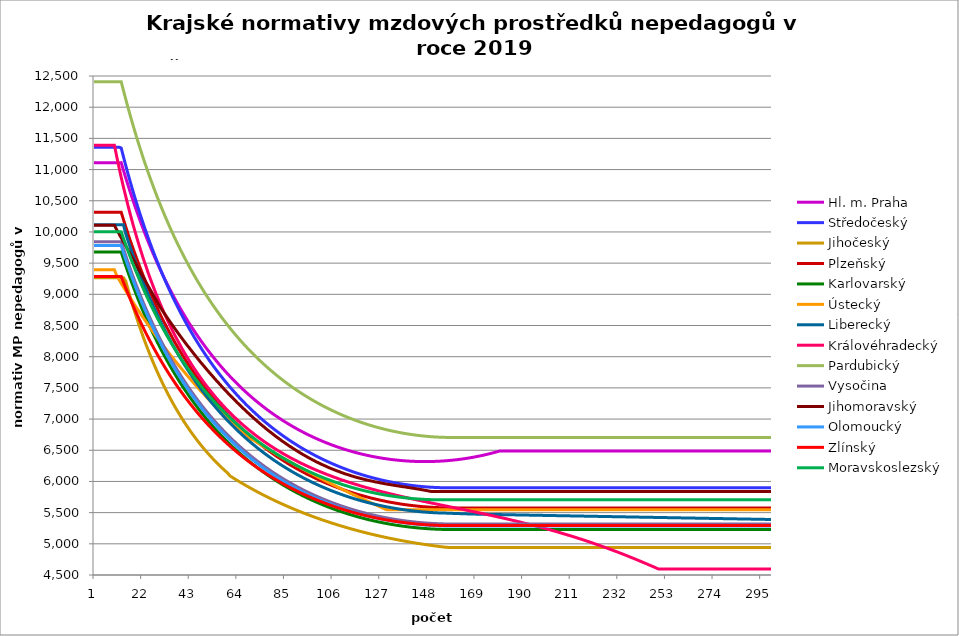
| Category | Hl. m. Praha | Středočeský | Jihočeský | Plzeňský | Karlovarský  | Ústecký   | Liberecký | Královéhradecký | Pardubický | Vysočina | Jihomoravský | Olomoucký | Zlínský | Moravskoslezský |
|---|---|---|---|---|---|---|---|---|---|---|---|---|---|---|
| 0 | 11109.441 | 11358.889 | 9267.509 | 10314.577 | 9676.562 | 9393.486 | 10113.352 | 11389.037 | 12408.336 | 9841.382 | 10108.319 | 9781.481 | 9286.742 | 10002.601 |
| 1 | 11109.441 | 11358.889 | 9267.509 | 10314.577 | 9676.562 | 9393.486 | 10113.352 | 11389.037 | 12408.336 | 9841.382 | 10108.319 | 9781.481 | 9286.742 | 10002.601 |
| 2 | 11109.441 | 11358.889 | 9267.509 | 10314.577 | 9676.562 | 9393.486 | 10113.352 | 11389.037 | 12408.336 | 9841.382 | 10108.319 | 9781.481 | 9286.742 | 10002.601 |
| 3 | 11109.441 | 11358.889 | 9267.509 | 10314.577 | 9676.562 | 9393.486 | 10113.352 | 11389.037 | 12408.336 | 9841.382 | 10108.319 | 9781.481 | 9286.742 | 10002.601 |
| 4 | 11109.441 | 11358.889 | 9267.509 | 10314.577 | 9676.562 | 9393.486 | 10113.352 | 11389.037 | 12408.336 | 9841.382 | 10108.319 | 9781.481 | 9286.742 | 10002.601 |
| 5 | 11109.441 | 11358.889 | 9267.509 | 10314.577 | 9676.562 | 9393.486 | 10113.352 | 11389.037 | 12408.336 | 9841.382 | 10108.319 | 9781.481 | 9286.742 | 10002.601 |
| 6 | 11109.441 | 11358.889 | 9267.509 | 10314.577 | 9676.562 | 9393.486 | 10113.352 | 11389.037 | 12408.336 | 9841.382 | 10108.319 | 9781.481 | 9286.742 | 10002.601 |
| 7 | 11109.441 | 11358.889 | 9267.509 | 10314.577 | 9676.562 | 9393.486 | 10113.352 | 11389.037 | 12408.336 | 9841.382 | 10108.319 | 9781.481 | 9286.742 | 10002.601 |
| 8 | 11109.441 | 11358.889 | 9267.509 | 10314.577 | 9676.562 | 9393.486 | 10113.352 | 11389.037 | 12408.336 | 9841.382 | 10108.319 | 9781.481 | 9286.742 | 10002.601 |
| 9 | 11109.441 | 11358.889 | 9267.509 | 10314.577 | 9676.562 | 9393.486 | 10113.352 | 11389.037 | 12408.336 | 9841.382 | 10108.319 | 9781.481 | 9286.742 | 10002.601 |
| 10 | 11109.441 | 11358.889 | 9267.509 | 10314.577 | 9676.562 | 9299.346 | 10113.352 | 11211.862 | 12408.336 | 9841.382 | 10035.904 | 9781.481 | 9286.742 | 10002.601 |
| 11 | 11109.441 | 11358.889 | 9267.509 | 10314.577 | 9676.562 | 9238.961 | 10113.352 | 11040.115 | 12408.336 | 9841.382 | 9972.864 | 9781.481 | 9286.742 | 10002.601 |
| 12 | 11111.32 | 11345.101 | 9267.509 | 10314.577 | 9676.648 | 9175.408 | 10113.442 | 10873.55 | 12408.446 | 9841.382 | 9906.489 | 9781.481 | 9286.742 | 10001.096 |
| 13 | 10987.337 | 11202.878 | 9267.509 | 10197.109 | 9565.606 | 9116.617 | 10113.557 | 10716.914 | 12266.056 | 9728.451 | 9840.992 | 9666.405 | 9192.038 | 9896.014 |
| 14 | 10866.988 | 11065.125 | 9210.044 | 10082.287 | 9457.821 | 9058.574 | 9971.097 | 10569.569 | 12127.843 | 9618.916 | 9776.355 | 9558.121 | 9099.877 | 9793.84 |
| 15 | 10750.127 | 10931.644 | 9078.972 | 9970.021 | 9353.159 | 8997.47 | 9859.802 | 10421.509 | 11993.634 | 9512.634 | 9708.602 | 9452.237 | 9010.164 | 9694.462 |
| 16 | 10636.614 | 10802.248 | 8952.877 | 9860.229 | 9251.493 | 8940.93 | 9751.714 | 10282.122 | 11863.267 | 9409.074 | 9645.687 | 9348.673 | 8922.81 | 9597.776 |
| 17 | 10526.316 | 10676.762 | 8831.502 | 9756.915 | 9152.704 | 8885.096 | 9646.703 | 10146.414 | 11736.589 | 9308.524 | 9579.726 | 9251.209 | 8837.728 | 9503.68 |
| 18 | 10419.108 | 10555.021 | 8714.604 | 9655.745 | 9056.679 | 8826.303 | 9544.649 | 10018.593 | 11613.455 | 9210.865 | 9514.662 | 9151.98 | 8754.838 | 9412.079 |
| 19 | 10314.871 | 10436.869 | 8601.96 | 9556.65 | 8963.31 | 8771.887 | 9445.434 | 9893.951 | 11493.727 | 9115.981 | 9446.727 | 9058.555 | 8674.062 | 9322.883 |
| 20 | 10213.494 | 10322.157 | 8493.359 | 9459.569 | 8872.494 | 8718.137 | 9348.95 | 9772.373 | 11377.274 | 9023.766 | 9383.452 | 8967.017 | 8595.325 | 9236.004 |
| 21 | 10114.868 | 10210.747 | 8388.608 | 9364.441 | 8784.137 | 8661.526 | 9255.093 | 9657.789 | 11263.972 | 8933.757 | 9317.371 | 8877.311 | 8518.559 | 9151.362 |
| 22 | 10018.892 | 10102.507 | 8287.522 | 9271.207 | 8698.146 | 8609.117 | 9163.764 | 9545.861 | 11153.705 | 8846.23 | 9252.214 | 8792.866 | 8443.694 | 9068.876 |
| 23 | 9925.471 | 9997.311 | 8189.931 | 9183.432 | 8614.433 | 8557.338 | 9074.869 | 9440.36 | 11046.359 | 8761.093 | 9187.963 | 8706.593 | 8370.669 | 8988.473 |
| 24 | 9834.511 | 9895.041 | 8095.673 | 9097.304 | 8532.917 | 8502.789 | 8988.319 | 9333.387 | 10941.83 | 8678.257 | 9124.598 | 8625.35 | 8299.42 | 8910.083 |
| 25 | 9745.927 | 9795.586 | 8004.599 | 9012.776 | 8453.517 | 8452.277 | 8904.03 | 9232.506 | 10840.016 | 8597.639 | 9062.1 | 8545.609 | 8229.891 | 8833.635 |
| 26 | 9659.634 | 9698.838 | 7916.567 | 8929.804 | 8376.16 | 8402.362 | 8821.92 | 9137.401 | 10740.82 | 8518.831 | 8997.053 | 8467.328 | 8162.024 | 8759.068 |
| 27 | 9575.553 | 9604.698 | 7831.445 | 8848.347 | 8300.774 | 8349.765 | 8741.914 | 9040.69 | 10644.151 | 8442.096 | 8932.933 | 8390.469 | 8095.767 | 8686.317 |
| 28 | 9493.61 | 9513.068 | 7749.107 | 8771.665 | 8227.29 | 8301.05 | 8663.937 | 8952.95 | 10549.923 | 8367.362 | 8869.721 | 8314.993 | 8031.069 | 8615.324 |
| 29 | 9413.731 | 9423.857 | 7669.435 | 8693.055 | 8155.644 | 8252.9 | 8587.921 | 8863.49 | 10458.051 | 8294.559 | 8804.14 | 8243.924 | 7967.88 | 8546.034 |
| 30 | 9335.849 | 9336.979 | 7592.32 | 8619.03 | 8085.774 | 8202.152 | 8513.799 | 8779.14 | 10368.456 | 8223.621 | 8749.155 | 8171.05 | 7906.155 | 8478.391 |
| 31 | 9259.897 | 9252.351 | 7517.656 | 8546.256 | 8017.621 | 8155.139 | 8441.507 | 8696.38 | 10281.062 | 8154.185 | 8694.852 | 8102.411 | 7845.847 | 8412.343 |
| 32 | 9185.813 | 9169.895 | 7445.345 | 8477.786 | 7951.128 | 8108.663 | 8370.986 | 8615.166 | 10195.798 | 8086.501 | 8641.219 | 8034.915 | 7786.915 | 8347.843 |
| 33 | 9113.538 | 9089.535 | 7375.293 | 8407.367 | 7886.242 | 8059.668 | 8302.176 | 8538.615 | 10112.593 | 8020.51 | 8588.244 | 7971.398 | 7729.317 | 8284.841 |
| 34 | 9043.013 | 9011.2 | 7307.413 | 8341.096 | 7822.91 | 8014.27 | 8235.023 | 8463.413 | 10031.383 | 7956.157 | 8535.914 | 7906.058 | 7673.013 | 8223.293 |
| 35 | 8974.184 | 8934.822 | 7241.62 | 8272.921 | 7761.084 | 7969.38 | 8169.474 | 8389.523 | 9952.102 | 7893.39 | 8484.218 | 7844.554 | 7617.966 | 8163.156 |
| 36 | 8906.998 | 8860.336 | 7177.838 | 8208.745 | 7700.716 | 7922.049 | 8105.478 | 8319.913 | 9874.692 | 7831.882 | 8433.144 | 7784 | 7564.14 | 8104.386 |
| 37 | 8841.406 | 8787.679 | 7115.989 | 8145.556 | 7641.761 | 7878.184 | 8042.987 | 8251.449 | 9799.094 | 7771.868 | 8382.682 | 7724.373 | 7511.498 | 8046.945 |
| 38 | 8777.36 | 8716.793 | 7056.005 | 8086.141 | 7584.176 | 7834.802 | 7981.955 | 8184.102 | 9725.252 | 7713.303 | 8332.82 | 7665.653 | 7460.009 | 7990.794 |
| 39 | 8714.812 | 8647.62 | 6997.817 | 8024.819 | 7527.919 | 7789.051 | 7922.337 | 8117.846 | 9653.114 | 7656.142 | 8283.548 | 7607.819 | 7409.639 | 7935.897 |
| 40 | 8653.72 | 8580.106 | 6941.361 | 7967.146 | 7472.952 | 7746.642 | 7864.09 | 8055.466 | 9582.628 | 7600.342 | 8234.855 | 7553.422 | 7360.357 | 7882.216 |
| 41 | 8594.04 | 8514.2 | 6886.578 | 7910.296 | 7419.234 | 7701.913 | 7807.175 | 7994.038 | 9513.746 | 7545.606 | 8186.731 | 7499.797 | 7312.134 | 7829.72 |
| 42 | 8535.732 | 8449.851 | 6833.41 | 7854.251 | 7366.731 | 7660.445 | 7751.551 | 7936.27 | 9446.421 | 7492.158 | 8141.949 | 7444.43 | 7264.941 | 7778.374 |
| 43 | 8478.757 | 8387.013 | 6781.803 | 7798.995 | 7315.407 | 7619.422 | 7697.181 | 7876.639 | 9380.607 | 7439.96 | 8094.901 | 7394.8 | 7218.751 | 7728.147 |
| 44 | 8423.077 | 8325.639 | 6731.703 | 7744.511 | 7265.227 | 7576.145 | 7644.029 | 7820.549 | 9316.262 | 7388.976 | 8048.395 | 7343.396 | 7173.537 | 7679.01 |
| 45 | 8368.657 | 8265.686 | 6683.062 | 7693.325 | 7216.161 | 7536.017 | 7592.061 | 7765.253 | 9253.343 | 7339.171 | 8002.419 | 7292.702 | 7129.272 | 7630.932 |
| 46 | 8315.462 | 8207.111 | 6635.833 | 7642.81 | 7168.176 | 7496.312 | 7541.244 | 7713.311 | 9191.812 | 7290.272 | 7956.966 | 7245.069 | 7085.934 | 7583.887 |
| 47 | 8263.458 | 8149.875 | 6589.97 | 7592.955 | 7121.244 | 7454.418 | 7491.544 | 7662.06 | 9131.63 | 7242.492 | 7912.027 | 7198.053 | 7043.497 | 7537.846 |
| 48 | 8212.614 | 8093.94 | 6545.432 | 7543.746 | 7075.334 | 7415.566 | 7442.932 | 7611.485 | 9072.76 | 7195.801 | 7870.192 | 7151.644 | 7001.939 | 7492.784 |
| 49 | 8162.899 | 8039.267 | 6502.177 | 7495.171 | 7030.42 | 7377.117 | 7395.379 | 7561.574 | 9015.166 | 7150.169 | 7826.224 | 7105.83 | 6961.238 | 7448.677 |
| 50 | 8114.283 | 7985.822 | 6460.166 | 7447.217 | 6986.475 | 7336.542 | 7348.855 | 7514.761 | 8958.815 | 7105.566 | 7782.745 | 7060.598 | 6921.373 | 7405.499 |
| 51 | 8066.739 | 7933.57 | 6419.363 | 7402.226 | 6943.473 | 7298.906 | 7303.333 | 7468.523 | 8903.673 | 7061.741 | 7739.747 | 7018.159 | 6882.322 | 7363.227 |
| 52 | 8020.237 | 7882.479 | 6379.731 | 7357.775 | 6901.39 | 7261.654 | 7258.787 | 7422.852 | 8849.71 | 7018.897 | 7699.709 | 6976.226 | 6844.067 | 7321.84 |
| 53 | 7974.753 | 7832.516 | 6341.238 | 7313.855 | 6860.201 | 7222.335 | 7215.192 | 7377.735 | 8796.893 | 6977.007 | 7657.621 | 6934.792 | 6806.588 | 7281.314 |
| 54 | 7930.26 | 7783.652 | 6303.85 | 7270.456 | 6819.885 | 7185.859 | 7172.523 | 7335.496 | 8745.195 | 6936.048 | 7615.99 | 6893.847 | 6769.866 | 7241.631 |
| 55 | 7886.734 | 7735.857 | 6267.538 | 7229.814 | 6780.419 | 7149.749 | 7130.756 | 7293.738 | 8694.587 | 6895.995 | 7577.219 | 6853.383 | 6733.884 | 7202.769 |
| 56 | 7844.152 | 7689.104 | 6232.271 | 7187.404 | 6741.781 | 7111.629 | 7089.87 | 7252.453 | 8645.042 | 6856.614 | 7536.456 | 6813.391 | 6698.624 | 7164.709 |
| 57 | 7802.49 | 7643.364 | 6198.021 | 7147.682 | 6703.952 | 7076.26 | 7049.842 | 7213.888 | 8596.533 | 6818.098 | 7496.128 | 6775.932 | 6664.071 | 7127.431 |
| 58 | 7761.727 | 7598.613 | 6164.762 | 7108.397 | 6666.911 | 7041.241 | 7010.65 | 7173.499 | 8549.035 | 6780.427 | 7458.566 | 6738.882 | 6630.207 | 7090.919 |
| 59 | 7721.841 | 7554.825 | 6132.468 | 7069.541 | 6630.639 | 7004.266 | 6972.276 | 7135.767 | 8502.524 | 6743.579 | 7419.065 | 6702.236 | 6597.017 | 7055.155 |
| 60 | 7682.813 | 7511.975 | 6088.277 | 7031.108 | 6595.119 | 6969.954 | 6934.698 | 7100.616 | 8456.976 | 6707.534 | 7382.269 | 6665.986 | 6564.486 | 7020.121 |
| 61 | 7644.621 | 7470.041 | 6065.288 | 6995.192 | 6560.332 | 6935.977 | 6897.899 | 7063.645 | 8412.368 | 6672.074 | 7343.571 | 6630.126 | 6532.599 | 6985.801 |
| 62 | 7607.248 | 7429 | 6042.645 | 6957.561 | 6526.26 | 6900.097 | 6861.859 | 7029.198 | 8368.678 | 6637.382 | 7307.518 | 6596.61 | 6501.343 | 6952.179 |
| 63 | 7570.675 | 7388.83 | 6020.342 | 6922.391 | 6492.889 | 6866.795 | 6826.561 | 6995.086 | 8325.885 | 6603.443 | 7269.597 | 6563.432 | 6470.704 | 6919.241 |
| 64 | 7534.884 | 7349.51 | 5998.374 | 6887.574 | 6460.201 | 6833.814 | 6791.989 | 6961.304 | 8283.969 | 6570.237 | 7234.265 | 6528.664 | 6440.669 | 6886.971 |
| 65 | 7499.857 | 7311.021 | 5976.735 | 6853.106 | 6428.18 | 6798.981 | 6758.125 | 6927.846 | 8242.909 | 6537.748 | 7199.274 | 6496.164 | 6411.224 | 6855.354 |
| 66 | 7465.579 | 7273.342 | 5955.42 | 6818.981 | 6396.813 | 6766.646 | 6724.953 | 6896.77 | 8202.687 | 6505.77 | 7164.621 | 6465.87 | 6382.358 | 6824.378 |
| 67 | 7432.033 | 7236.455 | 5934.423 | 6787.172 | 6366.085 | 6734.617 | 6692.459 | 6865.972 | 8163.284 | 6474.48 | 7130.299 | 6433.991 | 6354.058 | 6794.029 |
| 68 | 7399.204 | 7200.342 | 5913.74 | 6755.659 | 6335.981 | 6700.785 | 6660.627 | 6835.448 | 8124.681 | 6443.864 | 7096.305 | 6404.273 | 6326.313 | 6764.293 |
| 69 | 7367.077 | 7164.985 | 5893.366 | 6724.437 | 6306.488 | 6669.375 | 6629.443 | 6805.193 | 8086.863 | 6413.907 | 7062.633 | 6374.828 | 6299.112 | 6735.158 |
| 70 | 7335.637 | 7130.367 | 5873.295 | 6693.502 | 6277.594 | 6669.375 | 6598.893 | 6777.197 | 8049.811 | 6384.593 | 7029.28 | 6345.652 | 6272.443 | 6706.613 |
| 71 | 7304.87 | 7096.472 | 5853.523 | 6662.851 | 6249.285 | 6646.528 | 6568.964 | 6747.455 | 8013.51 | 6355.729 | 6996.24 | 6316.743 | 6246.297 | 6678.645 |
| 72 | 7274.763 | 7063.284 | 5834.045 | 6632.479 | 6221.549 | 6623.836 | 6539.642 | 6719.93 | 7977.944 | 6327.484 | 6965.545 | 6288.095 | 6220.663 | 6651.242 |
| 73 | 7245.302 | 7030.788 | 5814.856 | 6604.255 | 6194.374 | 6601.299 | 6510.915 | 6692.629 | 7943.097 | 6299.847 | 6933.1 | 6261.473 | 6195.531 | 6624.395 |
| 74 | 7216.476 | 6998.969 | 5795.953 | 6576.271 | 6167.749 | 6578.915 | 6482.771 | 6667.476 | 7908.956 | 6272.804 | 6902.957 | 6233.324 | 6170.891 | 6598.091 |
| 75 | 7188.271 | 6967.812 | 5777.331 | 6548.523 | 6141.663 | 6556.682 | 6455.197 | 6640.599 | 7875.506 | 6246.344 | 6873.074 | 6207.163 | 6146.735 | 6572.322 |
| 76 | 7160.676 | 6937.305 | 5758.985 | 6521.008 | 6116.105 | 6534.599 | 6428.183 | 6615.835 | 7842.733 | 6220.281 | 6841.482 | 6181.22 | 6123.052 | 6547.076 |
| 77 | 7133.68 | 6907.432 | 5740.912 | 6493.724 | 6091.065 | 6512.664 | 6401.718 | 6591.255 | 7810.623 | 6194.779 | 6812.128 | 6155.494 | 6099.835 | 6522.344 |
| 78 | 7107.27 | 6878.183 | 5723.107 | 6468.463 | 6066.532 | 6490.876 | 6375.789 | 6566.856 | 7779.164 | 6169.829 | 6784.957 | 6131.675 | 6077.075 | 6498.116 |
| 79 | 7081.437 | 6849.543 | 5705.567 | 6441.616 | 6042.497 | 6469.233 | 6350.388 | 6544.495 | 7748.344 | 6145.418 | 6756.085 | 6108.04 | 6054.764 | 6474.384 |
| 80 | 7056.17 | 6821.501 | 5688.287 | 6416.759 | 6018.95 | 6447.734 | 6325.505 | 6520.441 | 7718.149 | 6121.538 | 6727.458 | 6082.917 | 6032.893 | 6451.139 |
| 81 | 7031.459 | 6794.045 | 5671.265 | 6392.092 | 5995.882 | 6426.378 | 6301.128 | 6498.394 | 7688.569 | 6098.01 | 6700.957 | 6059.656 | 6011.455 | 6428.371 |
| 82 | 7007.294 | 6767.164 | 5654.496 | 6369.357 | 5973.284 | 6405.162 | 6277.249 | 6476.495 | 7659.592 | 6074.994 | 6674.664 | 6036.571 | 5990.442 | 6406.073 |
| 83 | 6983.666 | 6740.847 | 5637.976 | 6345.053 | 5951.148 | 6384.086 | 6253.859 | 6454.744 | 7631.207 | 6052.481 | 6646.721 | 6015.293 | 5969.847 | 6384.236 |
| 84 | 6960.565 | 6715.083 | 5621.703 | 6322.651 | 5929.465 | 6363.148 | 6230.949 | 6433.138 | 7603.403 | 6030.462 | 6622.692 | 5992.545 | 5949.664 | 6362.853 |
| 85 | 6937.983 | 6689.861 | 5605.672 | 6298.701 | 5908.228 | 6344.233 | 6208.51 | 6413.459 | 7576.17 | 6008.927 | 6597.008 | 5971.575 | 5929.884 | 6341.916 |
| 86 | 6915.911 | 6665.173 | 5589.881 | 6276.624 | 5887.427 | 6323.556 | 6186.534 | 6392.129 | 7549.497 | 5987.708 | 6571.523 | 5950.751 | 5910.502 | 6321.418 |
| 87 | 6894.34 | 6641.007 | 5574.326 | 6254.702 | 5867.056 | 6303.012 | 6165.013 | 6372.7 | 7523.375 | 5966.958 | 6548.034 | 5930.072 | 5891.51 | 6301.351 |
| 88 | 6873.264 | 6617.355 | 5559.004 | 6234.601 | 5847.108 | 6282.602 | 6143.938 | 6353.388 | 7497.795 | 5946.67 | 6524.712 | 5909.536 | 5872.903 | 6281.708 |
| 89 | 6852.673 | 6594.208 | 5543.912 | 6212.97 | 5827.574 | 6262.324 | 6123.303 | 6335.934 | 7472.747 | 5926.835 | 6501.556 | 5890.706 | 5854.674 | 6262.484 |
| 90 | 6832.56 | 6571.556 | 5529.046 | 6193.136 | 5808.449 | 6242.176 | 6103.099 | 6316.845 | 7448.222 | 5907.447 | 6478.564 | 5870.442 | 5836.818 | 6243.67 |
| 91 | 6812.918 | 6549.392 | 5514.405 | 6173.429 | 5789.725 | 6222.157 | 6083.321 | 6297.87 | 7424.212 | 5888.341 | 6455.733 | 5851.86 | 5819.329 | 6225.262 |
| 92 | 6793.741 | 6527.706 | 5499.984 | 6153.846 | 5771.396 | 6202.267 | 6063.96 | 6280.719 | 7400.709 | 5869.669 | 6434.801 | 5833.395 | 5802.2 | 6207.252 |
| 93 | 6775.02 | 6506.492 | 5485.781 | 6134.387 | 5753.455 | 6182.503 | 6045.01 | 6263.661 | 7377.703 | 5851.423 | 6414.005 | 5815.046 | 5785.428 | 6189.635 |
| 94 | 6756.749 | 6485.741 | 5471.793 | 6115.051 | 5735.897 | 6162.865 | 6026.464 | 6246.696 | 7355.188 | 5833.596 | 6393.342 | 5796.812 | 5769.005 | 6172.405 |
| 95 | 6738.922 | 6465.445 | 5458.018 | 6097.433 | 5718.715 | 6143.351 | 6008.317 | 6229.822 | 7333.155 | 5816.182 | 6372.812 | 5780.198 | 5752.928 | 6155.557 |
| 96 | 6721.533 | 6445.598 | 5444.453 | 6079.916 | 5701.903 | 6123.96 | 5990.561 | 6213.039 | 7311.598 | 5799.024 | 6354.109 | 5763.679 | 5737.191 | 6139.084 |
| 97 | 6704.576 | 6426.192 | 5431.095 | 6062.5 | 5685.457 | 6104.691 | 5973.192 | 6198.011 | 7290.509 | 5782.267 | 6335.515 | 5745.765 | 5721.79 | 6122.982 |
| 98 | 6688.044 | 6407.22 | 5417.941 | 6045.183 | 5669.37 | 6085.543 | 5956.203 | 6181.399 | 7269.88 | 5765.906 | 6315.354 | 5729.442 | 5706.719 | 6107.245 |
| 99 | 6671.932 | 6388.676 | 5404.99 | 6027.965 | 5653.637 | 6066.515 | 5939.588 | 6166.524 | 7249.706 | 5749.935 | 6298.651 | 5714.683 | 5691.974 | 6091.869 |
| 100 | 6656.235 | 6370.554 | 5392.238 | 6010.844 | 5638.253 | 6047.606 | 5923.342 | 6151.72 | 7229.979 | 5734.349 | 6280.38 | 5698.536 | 5677.551 | 6076.849 |
| 101 | 6640.947 | 6352.846 | 5379.684 | 5995.364 | 5623.214 | 6028.814 | 5907.46 | 6136.988 | 7210.694 | 5718.994 | 6263.861 | 5683.935 | 5663.445 | 6062.179 |
| 102 | 6626.064 | 6335.548 | 5367.325 | 5979.964 | 5608.513 | 6010.138 | 5891.937 | 6122.325 | 7191.844 | 5704.014 | 6247.429 | 5667.961 | 5649.653 | 6047.856 |
| 103 | 6611.579 | 6318.652 | 5355.159 | 5964.643 | 5594.148 | 5991.578 | 5876.768 | 6107.733 | 7173.422 | 5689.403 | 6231.083 | 5653.517 | 5636.169 | 6033.875 |
| 104 | 6597.49 | 6302.154 | 5343.183 | 5949.399 | 5580.112 | 5973.132 | 5861.947 | 6094.82 | 7155.424 | 5675.158 | 6214.823 | 5640.58 | 5622.991 | 6020.232 |
| 105 | 6583.789 | 6286.048 | 5331.395 | 5935.747 | 5566.402 | 5954.799 | 5847.471 | 6080.359 | 7137.843 | 5661.272 | 6200.26 | 5626.274 | 5610.114 | 6006.922 |
| 106 | 6570.475 | 6270.329 | 5319.793 | 5920.651 | 5553.013 | 5936.579 | 5833.334 | 6067.561 | 7120.675 | 5647.597 | 6185.766 | 5612.041 | 5597.535 | 5993.942 |
| 107 | 6557.541 | 6254.99 | 5308.376 | 5907.13 | 5539.941 | 5918.469 | 5819.533 | 6054.818 | 7103.913 | 5634.274 | 6171.34 | 5599.293 | 5585.25 | 5981.288 |
| 108 | 6544.984 | 6240.029 | 5297.14 | 5893.671 | 5527.183 | 5900.47 | 5806.062 | 6040.545 | 7087.553 | 5621.299 | 6158.573 | 5586.603 | 5573.255 | 5968.956 |
| 109 | 6532.799 | 6225.438 | 5286.085 | 5880.273 | 5514.734 | 5882.58 | 5792.918 | 6027.914 | 7071.589 | 5608.666 | 6144.272 | 5573.97 | 5561.548 | 5956.942 |
| 110 | 6520.984 | 6211.215 | 5275.208 | 5866.935 | 5502.59 | 5864.798 | 5780.097 | 6016.906 | 7056.017 | 5596.372 | 6131.617 | 5561.394 | 5550.124 | 5945.242 |
| 111 | 6509.534 | 6197.354 | 5264.507 | 5855.131 | 5490.748 | 5847.123 | 5767.596 | 6004.374 | 7040.832 | 5584.272 | 6119.013 | 5550.263 | 5538.981 | 5933.854 |
| 112 | 6498.445 | 6183.851 | 5253.98 | 5841.907 | 5479.205 | 5829.555 | 5755.409 | 5991.894 | 7026.03 | 5572.504 | 6108.028 | 5537.793 | 5528.116 | 5922.774 |
| 113 | 6487.714 | 6170.701 | 5243.625 | 5830.203 | 5467.956 | 5812.092 | 5743.534 | 5981.017 | 7011.605 | 5561.064 | 6095.521 | 5526.756 | 5517.525 | 5911.999 |
| 114 | 6477.338 | 6157.9 | 5233.442 | 5818.545 | 5458.362 | 5794.733 | 5731.966 | 5968.634 | 6997.555 | 5549.948 | 6084.619 | 5515.763 | 5507.206 | 5901.526 |
| 115 | 6467.313 | 6145.446 | 5223.427 | 5806.934 | 5446.33 | 5779.041 | 5720.704 | 5957.84 | 6983.874 | 5539.152 | 6073.757 | 5504.814 | 5497.156 | 5891.352 |
| 116 | 6457.637 | 6133.332 | 5213.579 | 5795.37 | 5435.946 | 5761.879 | 5709.742 | 5947.086 | 6970.559 | 5528.536 | 6062.933 | 5493.908 | 5487.371 | 5881.473 |
| 117 | 6448.306 | 6121.557 | 5203.897 | 5785.288 | 5425.844 | 5744.818 | 5699.079 | 5934.843 | 6957.605 | 5518.235 | 6053.686 | 5484.4 | 5477.851 | 5871.887 |
| 118 | 6439.318 | 6110.116 | 5194.379 | 5775.242 | 5416.022 | 5727.858 | 5688.71 | 5924.172 | 6945.01 | 5508.246 | 6044.467 | 5473.575 | 5468.591 | 5862.592 |
| 119 | 6430.669 | 6099.005 | 5185.024 | 5765.23 | 5406.476 | 5710.998 | 5678.634 | 5913.538 | 6932.769 | 5498.564 | 6035.276 | 5464.138 | 5459.589 | 5853.584 |
| 120 | 6422.357 | 6088.222 | 5175.829 | 5755.253 | 5397.204 | 5694.237 | 5668.846 | 5902.943 | 6920.879 | 5489.188 | 6026.113 | 5454.733 | 5450.844 | 5844.862 |
| 121 | 6414.38 | 6077.763 | 5166.793 | 5745.311 | 5388.202 | 5677.574 | 5659.345 | 5893.892 | 6909.337 | 5479.979 | 6016.978 | 5445.361 | 5442.352 | 5836.422 |
| 122 | 6406.735 | 6067.625 | 5157.915 | 5735.403 | 5379.469 | 5661.008 | 5650.127 | 5883.367 | 6898.138 | 5471.071 | 6009.387 | 5437.353 | 5434.112 | 5828.263 |
| 123 | 6399.42 | 6057.805 | 5149.193 | 5726.937 | 5371.002 | 5644.538 | 5641.19 | 5872.88 | 6887.281 | 5462.46 | 6001.815 | 5428.04 | 5426.121 | 5820.382 |
| 124 | 6392.432 | 6048.3 | 5140.626 | 5718.497 | 5362.799 | 5628.165 | 5632.532 | 5863.921 | 6876.762 | 5454.144 | 5992.753 | 5420.083 | 5418.378 | 5812.777 |
| 125 | 6385.771 | 6039.107 | 5132.212 | 5710.081 | 5354.857 | 5611.885 | 5624.15 | 5853.503 | 6866.578 | 5446.12 | 5986.727 | 5412.149 | 5410.879 | 5805.447 |
| 126 | 6379.432 | 6030.223 | 5123.951 | 5701.69 | 5347.175 | 5595.7 | 5616.041 | 5844.602 | 6856.727 | 5438.253 | 5979.212 | 5404.239 | 5403.624 | 5798.388 |
| 127 | 6373.416 | 6021.647 | 5115.84 | 5693.324 | 5339.749 | 5579.608 | 5608.203 | 5834.252 | 6847.204 | 5430.674 | 5971.715 | 5396.351 | 5396.611 | 5791.599 |
| 128 | 6367.719 | 6013.375 | 5107.878 | 5686.37 | 5332.578 | 5563.608 | 5600.635 | 5825.41 | 6838.009 | 5423.381 | 5965.731 | 5389.796 | 5389.837 | 5785.078 |
| 129 | 6362.34 | 6005.404 | 5100.065 | 5678.049 | 5325.66 | 5547.7 | 5593.334 | 5816.595 | 6829.138 | 5416.372 | 5958.269 | 5383.256 | 5383.3 | 5778.824 |
| 130 | 6357.278 | 5997.734 | 5092.399 | 5671.133 | 5318.993 | 5547.7 | 5586.298 | 5807.807 | 6820.59 | 5409.644 | 5952.312 | 5375.43 | 5377 | 5772.835 |
| 131 | 6352.532 | 5990.361 | 5084.878 | 5664.234 | 5312.576 | 5547.7 | 5579.525 | 5799.045 | 6812.361 | 5403.065 | 5946.367 | 5368.925 | 5370.935 | 5767.108 |
| 132 | 6348.099 | 5983.283 | 5077.502 | 5658.726 | 5306.406 | 5547.7 | 5573.013 | 5790.309 | 6804.449 | 5396.764 | 5940.434 | 5363.733 | 5365.102 | 5761.644 |
| 133 | 6343.978 | 5976.499 | 5070.269 | 5651.857 | 5300.482 | 5547.7 | 5566.761 | 5781.599 | 6796.852 | 5390.739 | 5934.513 | 5357.257 | 5359.501 | 5756.439 |
| 134 | 6340.169 | 5970.005 | 5063.179 | 5646.374 | 5294.802 | 5547.7 | 5560.767 | 5772.916 | 6789.569 | 5384.988 | 5928.603 | 5352.087 | 5354.131 | 5751.494 |
| 135 | 6336.67 | 5963.802 | 5056.229 | 5639.535 | 5289.365 | 5547.7 | 5555.029 | 5764.259 | 6782.597 | 5379.511 | 5922.706 | 5345.639 | 5348.989 | 5746.806 |
| 136 | 6333.48 | 5957.886 | 5049.42 | 5634.076 | 5284.169 | 5547.7 | 5549.546 | 5755.628 | 6775.934 | 5374.174 | 5916.82 | 5340.491 | 5344.075 | 5742.374 |
| 137 | 6330.598 | 5952.256 | 5042.749 | 5628.627 | 5279.213 | 5547.7 | 5544.316 | 5747.022 | 6769.579 | 5369.108 | 5912.413 | 5335.354 | 5339.387 | 5738.197 |
| 138 | 6328.023 | 5946.911 | 5036.217 | 5624.547 | 5274.496 | 5547.7 | 5539.337 | 5739.871 | 6763.53 | 5364.31 | 5906.548 | 5331.507 | 5334.924 | 5734.275 |
| 139 | 6325.756 | 5941.849 | 5029.821 | 5619.117 | 5270.016 | 5547.7 | 5534.609 | 5731.312 | 6757.785 | 5359.78 | 5900.694 | 5326.387 | 5330.685 | 5730.605 |
| 140 | 6323.794 | 5937.068 | 5023.561 | 5615.051 | 5265.772 | 5547.7 | 5530.131 | 5722.779 | 6752.343 | 5355.515 | 5894.851 | 5322.553 | 5326.669 | 5727.187 |
| 141 | 6322.137 | 5932.567 | 5017.437 | 5610.991 | 5261.763 | 5547.7 | 5525.9 | 5714.272 | 6747.203 | 5351.387 | 5889.021 | 5318.725 | 5322.875 | 5724.021 |
| 142 | 6320.785 | 5928.346 | 5011.446 | 5606.936 | 5257.988 | 5547.7 | 5521.917 | 5707.201 | 6742.362 | 5347.521 | 5883.202 | 5314.902 | 5319.302 | 5721.104 |
| 143 | 6319.738 | 5924.402 | 5005.589 | 5602.888 | 5254.446 | 5547.7 | 5518.179 | 5698.74 | 6737.82 | 5343.919 | 5877.394 | 5311.085 | 5315.95 | 5718.438 |
| 144 | 6318.995 | 5920.735 | 4999.864 | 5598.846 | 5251.136 | 5547.7 | 5514.686 | 5691.708 | 6733.576 | 5340.578 | 5871.598 | 5307.273 | 5312.816 | 5716.02 |
| 145 | 6318.557 | 5917.344 | 4994.27 | 5596.154 | 5248.057 | 5547.7 | 5511.437 | 5683.292 | 6729.628 | 5337.498 | 5864.368 | 5304.735 | 5309.902 | 5713.85 |
| 146 | 6318.422 | 5914.227 | 4988.807 | 5593.465 | 5245.209 | 5547.7 | 5508.431 | 5676.298 | 6725.975 | 5334.55 | 5858.598 | 5300.932 | 5307.205 | 5711.928 |
| 147 | 6318.59 | 5911.384 | 4983.473 | 5590.778 | 5242.59 | 5547.7 | 5505.667 | 5667.928 | 6722.617 | 5331.861 | 5851.4 | 5298.4 | 5304.725 | 5710.253 |
| 148 | 6319.063 | 5908.815 | 4978.269 | 5588.094 | 5240.2 | 5547.7 | 5503.145 | 5660.972 | 6719.552 | 5329.43 | 5844.221 | 5295.87 | 5302.462 | 5708.825 |
| 149 | 6319.84 | 5906.517 | 4973.193 | 5585.413 | 5238.038 | 5547.7 | 5500.864 | 5652.647 | 6716.78 | 5327.257 | 5837.059 | 5294.606 | 5300.415 | 5707.643 |
| 150 | 6320.921 | 5904.492 | 4968.244 | 5582.734 | 5236.104 | 5547.7 | 5498.823 | 5645.728 | 6714.3 | 5325.342 | 5837.059 | 5292.08 | 5298.584 | 5706.707 |
| 151 | 6322.306 | 5902.737 | 4963.422 | 5581.395 | 5234.397 | 5547.7 | 5497.022 | 5637.448 | 6712.112 | 5323.555 | 5837.059 | 5290.818 | 5296.968 | 5706.017 |
| 152 | 6323.997 | 5901.254 | 4958.726 | 5580.058 | 5232.918 | 5547.7 | 5495.461 | 5630.566 | 6710.214 | 5322.024 | 5837.059 | 5289.557 | 5295.566 | 5705.573 |
| 153 | 6325.992 | 5900.04 | 4954.155 | 5578.72 | 5231.664 | 5547.7 | 5494.138 | 5622.331 | 6708.606 | 5320.749 | 5837.059 | 5288.296 | 5294.379 | 5705.374 |
| 154 | 6328.294 | 5899.097 | 4949.709 | 5577.384 | 5230.637 | 5547.7 | 5493.054 | 5615.486 | 6707.289 | 5319.73 | 5837.059 | 5287.035 | 5293.406 | 5704.821 |
| 155 | 6330.903 | 5898.423 | 4945.387 | 5577.384 | 5229.835 | 5547.7 | 5492.208 | 5607.294 | 6706.261 | 5318.966 | 5837.059 | 5285.776 | 5292.646 | 5704.821 |
| 156 | 6333.819 | 5898.019 | 4942.671 | 5576.048 | 5229.259 | 5547.7 | 5491.6 | 5600.486 | 6705.522 | 5318.329 | 5837.059 | 5285.776 | 5292.101 | 5704.821 |
| 157 | 6337.043 | 5897.885 | 4942.671 | 5576.048 | 5228.908 | 5547.7 | 5489.619 | 5592.338 | 6705.073 | 5317.947 | 5837.059 | 5284.516 | 5291.769 | 5704.821 |
| 158 | 6340.577 | 5898.019 | 4942.671 | 5576.048 | 5228.783 | 5547.7 | 5488.299 | 5585.566 | 6704.912 | 5317.819 | 5837.059 | 5284.516 | 5291.65 | 5704.821 |
| 159 | 6344.421 | 5897.885 | 4942.671 | 5576.048 | 5228.883 | 5547.7 | 5486.98 | 5577.461 | 6704.72 | 5317.692 | 5837.059 | 5284.516 | 5291.65 | 5704.821 |
| 160 | 6348.576 | 5897.885 | 4942.671 | 5576.048 | 5228.633 | 5547.7 | 5485.661 | 5570.725 | 6704.72 | 5317.692 | 5837.059 | 5284.516 | 5291.65 | 5704.821 |
| 161 | 6353.044 | 5897.885 | 4942.671 | 5576.048 | 5228.633 | 5547.7 | 5484.343 | 5562.663 | 6704.72 | 5317.692 | 5837.059 | 5284.516 | 5291.65 | 5704.821 |
| 162 | 6357.825 | 5897.885 | 4942.671 | 5576.048 | 5228.633 | 5547.7 | 5483.026 | 5555.962 | 6704.72 | 5317.692 | 5837.059 | 5284.516 | 5291.65 | 5704.821 |
| 163 | 6362.922 | 5897.885 | 4942.671 | 5576.048 | 5228.633 | 5547.7 | 5481.709 | 5547.943 | 6704.72 | 5317.692 | 5837.059 | 5284.516 | 5291.65 | 5704.821 |
| 164 | 6368.336 | 5897.885 | 4942.671 | 5576.048 | 5228.633 | 5547.7 | 5480.393 | 5541.278 | 6704.72 | 5317.692 | 5837.059 | 5284.516 | 5291.65 | 5704.821 |
| 165 | 6374.068 | 5897.885 | 4942.671 | 5576.048 | 5228.633 | 5547.7 | 5479.077 | 5533.301 | 6704.72 | 5317.692 | 5837.059 | 5284.516 | 5291.65 | 5704.821 |
| 166 | 6380.121 | 5897.885 | 4942.671 | 5576.048 | 5228.633 | 5547.7 | 5477.762 | 5525.347 | 6704.72 | 5317.692 | 5837.059 | 5284.516 | 5291.65 | 5704.821 |
| 167 | 6386.495 | 5897.885 | 4942.671 | 5576.048 | 5228.633 | 5547.7 | 5476.448 | 5517.416 | 6704.72 | 5317.692 | 5837.059 | 5284.516 | 5291.65 | 5704.821 |
| 168 | 6393.193 | 5897.885 | 4942.671 | 5576.048 | 5228.633 | 5547.7 | 5476.448 | 5510.824 | 6704.72 | 5317.692 | 5837.059 | 5284.516 | 5291.65 | 5704.821 |
| 169 | 6400.216 | 5897.885 | 4942.671 | 5576.048 | 5228.633 | 5547.7 | 5475.135 | 5502.935 | 6704.72 | 5317.692 | 5837.059 | 5284.516 | 5291.65 | 5704.821 |
| 170 | 6407.568 | 5897.885 | 4942.671 | 5576.048 | 5228.633 | 5547.7 | 5474.421 | 5495.068 | 6704.72 | 5317.692 | 5837.059 | 5284.516 | 5291.65 | 5704.821 |
| 171 | 6415.25 | 5897.885 | 4942.671 | 5576.048 | 5228.633 | 5547.7 | 5473.755 | 5487.223 | 6704.72 | 5317.692 | 5837.059 | 5284.516 | 5291.65 | 5704.821 |
| 172 | 6423.264 | 5897.885 | 4942.671 | 5576.048 | 5228.633 | 5547.7 | 5473.089 | 5479.401 | 6704.72 | 5317.692 | 5837.059 | 5284.516 | 5291.65 | 5704.821 |
| 173 | 6431.613 | 5897.885 | 4942.671 | 5576.048 | 5228.633 | 5547.7 | 5472.423 | 5471.601 | 6704.72 | 5317.692 | 5837.059 | 5284.516 | 5291.65 | 5704.821 |
| 174 | 6440.3 | 5897.885 | 4942.671 | 5576.048 | 5228.633 | 5547.7 | 5471.757 | 5463.824 | 6704.72 | 5317.692 | 5837.059 | 5284.516 | 5291.65 | 5704.821 |
| 175 | 6449.326 | 5897.885 | 4942.671 | 5576.048 | 5228.633 | 5547.7 | 5471.091 | 5456.068 | 6704.72 | 5317.692 | 5837.059 | 5284.516 | 5291.65 | 5704.821 |
| 176 | 6458.695 | 5897.885 | 4942.671 | 5576.048 | 5228.633 | 5547.7 | 5470.425 | 5448.335 | 6704.72 | 5317.692 | 5837.059 | 5284.516 | 5291.65 | 5704.821 |
| 177 | 6468.41 | 5897.885 | 4942.671 | 5576.048 | 5228.633 | 5547.7 | 5469.76 | 5440.623 | 6704.72 | 5317.692 | 5837.059 | 5284.516 | 5291.65 | 5704.821 |
| 178 | 6478.474 | 5897.885 | 4942.671 | 5576.048 | 5228.633 | 5547.7 | 5469.095 | 5431.653 | 6704.72 | 5317.692 | 5837.059 | 5284.516 | 5291.65 | 5704.821 |
| 179 | 6488.889 | 5897.885 | 4942.671 | 5576.048 | 5228.633 | 5547.7 | 5468.43 | 5423.989 | 6704.72 | 5317.692 | 5837.059 | 5284.516 | 5291.65 | 5704.821 |
| 180 | 6488.889 | 5897.885 | 4942.671 | 5576.048 | 5228.633 | 5547.7 | 5467.765 | 5416.346 | 6704.72 | 5317.692 | 5837.059 | 5284.516 | 5291.65 | 5704.821 |
| 181 | 6488.889 | 5897.885 | 4942.671 | 5576.048 | 5228.633 | 5547.7 | 5467.1 | 5407.456 | 6704.72 | 5317.692 | 5837.059 | 5284.516 | 5291.65 | 5704.821 |
| 182 | 6488.889 | 5897.885 | 4942.671 | 5576.048 | 5228.633 | 5547.7 | 5466.435 | 5399.86 | 6704.72 | 5317.692 | 5837.059 | 5284.516 | 5291.65 | 5704.821 |
| 183 | 6488.889 | 5897.885 | 4942.671 | 5576.048 | 5228.633 | 5547.7 | 5465.771 | 5391.024 | 6704.72 | 5317.692 | 5837.059 | 5284.516 | 5291.65 | 5704.821 |
| 184 | 6488.889 | 5897.885 | 4942.671 | 5576.048 | 5228.633 | 5547.7 | 5465.107 | 5382.217 | 6704.72 | 5317.692 | 5837.059 | 5284.516 | 5291.65 | 5704.821 |
| 185 | 6488.889 | 5897.885 | 4942.671 | 5576.048 | 5228.633 | 5547.7 | 5464.443 | 5373.439 | 6704.72 | 5317.692 | 5837.059 | 5284.516 | 5291.65 | 5704.821 |
| 186 | 6488.889 | 5897.885 | 4942.671 | 5576.048 | 5228.633 | 5547.7 | 5463.779 | 5365.938 | 6704.72 | 5317.692 | 5837.059 | 5284.516 | 5291.65 | 5704.821 |
| 187 | 6488.889 | 5897.885 | 4942.671 | 5576.048 | 5228.633 | 5547.7 | 5463.115 | 5357.213 | 6704.72 | 5317.692 | 5837.059 | 5284.516 | 5291.65 | 5704.821 |
| 188 | 6488.889 | 5897.885 | 4942.671 | 5576.048 | 5228.633 | 5547.7 | 5462.451 | 5348.516 | 6704.72 | 5317.692 | 5837.059 | 5284.516 | 5291.65 | 5704.821 |
| 189 | 6488.889 | 5897.885 | 4942.671 | 5576.048 | 5228.633 | 5547.7 | 5461.788 | 5338.611 | 6704.72 | 5317.692 | 5837.059 | 5284.516 | 5291.65 | 5704.821 |
| 190 | 6488.889 | 5897.885 | 4942.671 | 5576.048 | 5228.633 | 5547.7 | 5461.124 | 5329.975 | 6704.72 | 5317.692 | 5837.059 | 5284.516 | 5291.65 | 5704.821 |
| 191 | 6488.889 | 5897.885 | 4942.671 | 5576.048 | 5228.633 | 5547.7 | 5460.461 | 5321.366 | 6704.72 | 5317.692 | 5837.059 | 5284.516 | 5291.65 | 5704.821 |
| 192 | 6488.889 | 5897.885 | 4942.671 | 5576.048 | 5228.633 | 5547.7 | 5459.798 | 5311.561 | 6704.72 | 5317.692 | 5837.059 | 5284.516 | 5291.65 | 5704.821 |
| 193 | 6488.889 | 5897.885 | 4942.671 | 5576.048 | 5228.633 | 5547.7 | 5459.135 | 5303.012 | 6704.72 | 5317.692 | 5837.059 | 5284.516 | 5291.65 | 5704.821 |
| 194 | 6488.889 | 5897.885 | 4942.671 | 5576.048 | 5228.633 | 5547.7 | 5458.473 | 5293.275 | 6704.72 | 5317.692 | 5837.059 | 5284.516 | 5291.65 | 5704.821 |
| 195 | 6488.889 | 5897.885 | 4942.671 | 5576.048 | 5228.633 | 5547.7 | 5457.81 | 5283.574 | 6704.72 | 5317.692 | 5837.059 | 5284.516 | 5291.65 | 5704.821 |
| 196 | 6488.889 | 5897.885 | 4942.671 | 5576.048 | 5228.633 | 5547.7 | 5457.148 | 5273.908 | 6704.72 | 5317.692 | 5837.059 | 5284.516 | 5291.65 | 5704.821 |
| 197 | 6488.889 | 5897.885 | 4942.671 | 5576.048 | 5228.633 | 5547.7 | 5456.486 | 5264.278 | 6704.72 | 5317.692 | 5837.059 | 5284.516 | 5291.65 | 5704.821 |
| 198 | 6488.889 | 5897.885 | 4942.671 | 5576.048 | 5228.633 | 5547.7 | 5455.824 | 5254.682 | 6704.72 | 5317.692 | 5837.059 | 5284.516 | 5291.65 | 5704.821 |
| 199 | 6488.889 | 5897.885 | 4942.671 | 5576.048 | 5228.633 | 5547.7 | 5455.162 | 5245.122 | 6704.72 | 5317.692 | 5837.059 | 5284.516 | 5291.65 | 5704.821 |
| 200 | 6488.889 | 5897.885 | 4942.671 | 5576.048 | 5228.633 | 5547.7 | 5454.5 | 5235.596 | 6704.72 | 5317.692 | 5837.059 | 5284.516 | 5291.65 | 5704.821 |
| 201 | 6488.889 | 5897.885 | 4942.671 | 5576.048 | 5228.633 | 5547.7 | 5453.838 | 5224.921 | 6704.72 | 5317.692 | 5837.059 | 5284.516 | 5291.65 | 5704.821 |
| 202 | 6488.889 | 5897.885 | 4942.671 | 5576.048 | 5228.633 | 5547.7 | 5453.177 | 5215.468 | 6704.72 | 5317.692 | 5837.059 | 5284.516 | 5291.65 | 5704.821 |
| 203 | 6488.889 | 5897.885 | 4942.671 | 5576.048 | 5228.633 | 5547.7 | 5452.516 | 5204.875 | 6704.72 | 5317.692 | 5837.059 | 5284.516 | 5291.65 | 5704.821 |
| 204 | 6488.889 | 5897.885 | 4942.671 | 5576.048 | 5228.633 | 5547.7 | 5451.855 | 5194.324 | 6704.72 | 5317.692 | 5837.059 | 5284.516 | 5291.65 | 5704.821 |
| 205 | 6488.889 | 5897.885 | 4942.671 | 5576.048 | 5228.633 | 5547.7 | 5451.194 | 5183.817 | 6704.72 | 5317.692 | 5837.059 | 5284.516 | 5291.65 | 5704.821 |
| 206 | 6488.889 | 5897.885 | 4942.671 | 5576.048 | 5228.633 | 5547.7 | 5450.533 | 5173.351 | 6704.72 | 5317.692 | 5837.059 | 5284.516 | 5291.65 | 5704.821 |
| 207 | 6488.889 | 5897.885 | 4942.671 | 5576.048 | 5228.633 | 5547.7 | 5449.872 | 5161.773 | 6704.72 | 5317.692 | 5837.059 | 5284.516 | 5291.65 | 5704.821 |
| 208 | 6488.889 | 5897.885 | 4942.671 | 5576.048 | 5228.633 | 5547.7 | 5449.212 | 5151.396 | 6704.72 | 5317.692 | 5837.059 | 5284.516 | 5291.65 | 5704.821 |
| 209 | 6488.889 | 5897.885 | 4942.671 | 5576.048 | 5228.633 | 5547.7 | 5448.552 | 5139.915 | 6704.72 | 5317.692 | 5837.059 | 5284.516 | 5291.65 | 5704.821 |
| 210 | 6488.889 | 5897.885 | 4942.671 | 5576.048 | 5228.633 | 5547.7 | 5447.892 | 5129.626 | 6704.72 | 5317.692 | 5837.059 | 5284.516 | 5291.65 | 5704.821 |
| 211 | 6488.889 | 5897.885 | 4942.671 | 5576.048 | 5228.633 | 5547.7 | 5447.232 | 5118.242 | 6704.72 | 5317.692 | 5837.059 | 5284.516 | 5291.65 | 5704.821 |
| 212 | 6488.889 | 5897.885 | 4942.671 | 5576.048 | 5228.633 | 5547.7 | 5446.572 | 5106.909 | 6704.72 | 5317.692 | 5837.059 | 5284.516 | 5291.65 | 5704.821 |
| 213 | 6488.889 | 5897.885 | 4942.671 | 5576.048 | 5228.633 | 5547.7 | 5445.912 | 5095.625 | 6704.72 | 5317.692 | 5837.059 | 5284.516 | 5291.65 | 5704.821 |
| 214 | 6488.889 | 5897.885 | 4942.671 | 5576.048 | 5228.633 | 5547.7 | 5445.253 | 5083.271 | 6704.72 | 5317.692 | 5837.059 | 5284.516 | 5291.65 | 5704.821 |
| 215 | 6488.889 | 5897.885 | 4942.671 | 5576.048 | 5228.633 | 5547.7 | 5444.593 | 5072.091 | 6704.72 | 5317.692 | 5837.059 | 5284.516 | 5291.65 | 5704.821 |
| 216 | 6488.889 | 5897.885 | 4942.671 | 5576.048 | 5228.633 | 5547.7 | 5443.934 | 5059.851 | 6704.72 | 5317.692 | 5837.059 | 5284.516 | 5291.65 | 5704.821 |
| 217 | 6488.889 | 5897.885 | 4942.671 | 5576.048 | 5228.633 | 5547.7 | 5443.275 | 5047.669 | 6704.72 | 5317.692 | 5837.059 | 5284.516 | 5291.65 | 5704.821 |
| 218 | 6488.889 | 5897.885 | 4942.671 | 5576.048 | 5228.633 | 5547.7 | 5442.616 | 5035.546 | 6704.72 | 5317.692 | 5837.059 | 5284.516 | 5291.65 | 5704.821 |
| 219 | 6488.889 | 5897.885 | 4942.671 | 5576.048 | 5228.633 | 5547.7 | 5441.958 | 5023.481 | 6704.72 | 5317.692 | 5837.059 | 5284.516 | 5291.65 | 5704.821 |
| 220 | 6488.889 | 5897.885 | 4942.671 | 5576.048 | 5228.633 | 5547.7 | 5441.299 | 5011.473 | 6704.72 | 5317.692 | 5837.059 | 5284.516 | 5291.65 | 5704.821 |
| 221 | 6488.889 | 5897.885 | 4942.671 | 5576.048 | 5228.633 | 5547.7 | 5440.641 | 4998.44 | 6704.72 | 5317.692 | 5837.059 | 5284.516 | 5291.65 | 5704.821 |
| 222 | 6488.889 | 5897.885 | 4942.671 | 5576.048 | 5228.633 | 5547.7 | 5439.983 | 4985.473 | 6704.72 | 5317.692 | 5837.059 | 5284.516 | 5291.65 | 5704.821 |
| 223 | 6488.889 | 5897.885 | 4942.671 | 5576.048 | 5228.633 | 5547.7 | 5439.325 | 4973.647 | 6704.72 | 5317.692 | 5837.059 | 5284.516 | 5291.65 | 5704.821 |
| 224 | 6488.889 | 5897.885 | 4942.671 | 5576.048 | 5228.633 | 5547.7 | 5438.667 | 4960.809 | 6704.72 | 5317.692 | 5837.059 | 5284.516 | 5291.65 | 5704.821 |
| 225 | 6488.889 | 5897.885 | 4942.671 | 5576.048 | 5228.633 | 5547.7 | 5438.009 | 4946.976 | 6704.72 | 5317.692 | 5837.059 | 5284.516 | 5291.65 | 5704.821 |
| 226 | 6488.889 | 5897.885 | 4942.671 | 5576.048 | 5228.633 | 5547.7 | 5437.352 | 4934.275 | 6704.72 | 5317.692 | 5837.059 | 5284.516 | 5291.65 | 5704.821 |
| 227 | 6488.889 | 5897.885 | 4942.671 | 5576.048 | 5228.633 | 5547.7 | 5436.694 | 4920.589 | 6704.72 | 5317.692 | 5837.059 | 5284.516 | 5291.65 | 5704.821 |
| 228 | 6488.889 | 5897.885 | 4942.671 | 5576.048 | 5228.633 | 5547.7 | 5436.037 | 4906.979 | 6704.72 | 5317.692 | 5837.059 | 5284.516 | 5291.65 | 5704.821 |
| 229 | 6488.889 | 5897.885 | 4942.671 | 5576.048 | 5228.633 | 5547.7 | 5435.38 | 4893.444 | 6704.72 | 5317.692 | 5837.059 | 5284.516 | 5291.65 | 5704.821 |
| 230 | 6488.889 | 5897.885 | 4942.671 | 5576.048 | 5228.633 | 5547.7 | 5434.723 | 4879.983 | 6704.72 | 5317.692 | 5837.059 | 5284.516 | 5291.65 | 5704.821 |
| 231 | 6488.889 | 5897.885 | 4942.671 | 5576.048 | 5228.633 | 5547.7 | 5434.066 | 4866.596 | 6704.72 | 5317.692 | 5837.059 | 5284.516 | 5291.65 | 5704.821 |
| 232 | 6488.889 | 5897.885 | 4942.671 | 5576.048 | 5228.633 | 5547.7 | 5433.41 | 4852.262 | 6704.72 | 5317.692 | 5837.059 | 5284.516 | 5291.65 | 5704.821 |
| 233 | 6488.889 | 5897.885 | 4942.671 | 5576.048 | 5228.633 | 5547.7 | 5432.753 | 4838.011 | 6704.72 | 5317.692 | 5837.059 | 5284.516 | 5291.65 | 5704.821 |
| 234 | 6488.889 | 5897.885 | 4942.671 | 5576.048 | 5228.633 | 5547.7 | 5432.097 | 4823.844 | 6704.72 | 5317.692 | 5837.059 | 5284.516 | 5291.65 | 5704.821 |
| 235 | 6488.889 | 5897.885 | 4942.671 | 5576.048 | 5228.633 | 5547.7 | 5431.441 | 4809.76 | 6704.72 | 5317.692 | 5837.059 | 5284.516 | 5291.65 | 5704.821 |
| 236 | 6488.889 | 5897.885 | 4942.671 | 5576.048 | 5228.633 | 5547.7 | 5430.785 | 4794.761 | 6704.72 | 5317.692 | 5837.059 | 5284.516 | 5291.65 | 5704.821 |
| 237 | 6488.889 | 5897.885 | 4942.671 | 5576.048 | 5228.633 | 5547.7 | 5430.129 | 4779.855 | 6704.72 | 5317.692 | 5837.059 | 5284.516 | 5291.65 | 5704.821 |
| 238 | 6488.889 | 5897.885 | 4942.671 | 5576.048 | 5228.633 | 5547.7 | 5429.473 | 4766.026 | 6704.72 | 5317.692 | 5837.059 | 5284.516 | 5291.65 | 5704.821 |
| 239 | 6488.889 | 5897.885 | 4942.671 | 5576.048 | 5228.633 | 5547.7 | 5428.818 | 4750.319 | 6704.72 | 5317.692 | 5837.059 | 5284.516 | 5291.65 | 5704.821 |
| 240 | 6488.889 | 5897.885 | 4942.671 | 5576.048 | 5228.633 | 5547.7 | 5428.162 | 4735.688 | 6704.72 | 5317.692 | 5837.059 | 5284.516 | 5291.65 | 5704.821 |
| 241 | 6488.889 | 5897.885 | 4942.671 | 5576.048 | 5228.633 | 5547.7 | 5427.507 | 4720.18 | 6704.72 | 5317.692 | 5837.059 | 5284.516 | 5291.65 | 5704.821 |
| 242 | 6488.889 | 5897.885 | 4942.671 | 5576.048 | 5228.633 | 5547.7 | 5426.852 | 4704.774 | 6704.72 | 5317.692 | 5837.059 | 5284.516 | 5291.65 | 5704.821 |
| 243 | 6488.889 | 5897.885 | 4942.671 | 5576.048 | 5228.633 | 5547.7 | 5426.197 | 4689.467 | 6704.72 | 5317.692 | 5837.059 | 5284.516 | 5291.65 | 5704.821 |
| 244 | 6488.889 | 5897.885 | 4942.671 | 5576.048 | 5228.633 | 5547.7 | 5425.543 | 4674.26 | 6704.72 | 5317.692 | 5837.059 | 5284.516 | 5291.65 | 5704.821 |
| 245 | 6488.889 | 5897.885 | 4942.671 | 5576.048 | 5228.633 | 5547.7 | 5424.888 | 4658.21 | 6704.72 | 5317.692 | 5837.059 | 5284.516 | 5291.65 | 5704.821 |
| 246 | 6488.889 | 5897.885 | 4942.671 | 5576.048 | 5228.633 | 5547.7 | 5424.234 | 4643.205 | 6704.72 | 5317.692 | 5837.059 | 5284.516 | 5291.65 | 5704.821 |
| 247 | 6488.889 | 5897.885 | 4942.671 | 5576.048 | 5228.633 | 5547.7 | 5423.579 | 4627.368 | 6704.72 | 5317.692 | 5837.059 | 5284.516 | 5291.65 | 5704.821 |
| 248 | 6488.889 | 5897.885 | 4942.671 | 5576.048 | 5228.633 | 5547.7 | 5422.925 | 4610.716 | 6704.72 | 5317.692 | 5837.059 | 5284.516 | 5291.65 | 5704.821 |
| 249 | 6488.889 | 5897.885 | 4942.671 | 5576.048 | 5228.633 | 5547.7 | 5422.271 | 4595.099 | 6704.72 | 5317.692 | 5837.059 | 5284.516 | 5291.65 | 5704.821 |
| 250 | 6488.889 | 5897.885 | 4942.671 | 5576.048 | 5228.633 | 5547.7 | 5421.618 | 4595.099 | 6704.72 | 5317.692 | 5837.059 | 5284.516 | 5291.65 | 5704.821 |
| 251 | 6488.889 | 5897.885 | 4942.671 | 5576.048 | 5228.633 | 5547.7 | 5420.964 | 4595.099 | 6704.72 | 5317.692 | 5837.059 | 5284.516 | 5291.65 | 5704.821 |
| 252 | 6488.889 | 5897.885 | 4942.671 | 5576.048 | 5228.633 | 5547.7 | 5420.311 | 4595.099 | 6704.72 | 5317.692 | 5837.059 | 5284.516 | 5291.65 | 5704.821 |
| 253 | 6488.889 | 5897.885 | 4942.671 | 5576.048 | 5228.633 | 5547.7 | 5419.657 | 4595.099 | 6704.72 | 5317.692 | 5837.059 | 5284.516 | 5291.65 | 5704.821 |
| 254 | 6488.889 | 5897.885 | 4942.671 | 5576.048 | 5228.633 | 5547.7 | 5419.004 | 4595.099 | 6704.72 | 5317.692 | 5837.059 | 5284.516 | 5291.65 | 5704.821 |
| 255 | 6488.889 | 5897.885 | 4942.671 | 5576.048 | 5228.633 | 5547.7 | 5418.351 | 4595.099 | 6704.72 | 5317.692 | 5837.059 | 5284.516 | 5291.65 | 5704.821 |
| 256 | 6488.889 | 5897.885 | 4942.671 | 5576.048 | 5228.633 | 5547.7 | 5417.698 | 4595.099 | 6704.72 | 5317.692 | 5837.059 | 5284.516 | 5291.65 | 5704.821 |
| 257 | 6488.889 | 5897.885 | 4942.671 | 5576.048 | 5228.633 | 5547.7 | 5417.046 | 4595.099 | 6704.72 | 5317.692 | 5837.059 | 5284.516 | 5291.65 | 5704.821 |
| 258 | 6488.889 | 5897.885 | 4942.671 | 5576.048 | 5228.633 | 5547.7 | 5416.393 | 4595.099 | 6704.72 | 5317.692 | 5837.059 | 5284.516 | 5291.65 | 5704.821 |
| 259 | 6488.889 | 5897.885 | 4942.671 | 5576.048 | 5228.633 | 5547.7 | 5415.741 | 4595.099 | 6704.72 | 5317.692 | 5837.059 | 5284.516 | 5291.65 | 5704.821 |
| 260 | 6488.889 | 5897.885 | 4942.671 | 5576.048 | 5228.633 | 5547.7 | 5415.089 | 4595.099 | 6704.72 | 5317.692 | 5837.059 | 5284.516 | 5291.65 | 5704.821 |
| 261 | 6488.889 | 5897.885 | 4942.671 | 5576.048 | 5228.633 | 5547.7 | 5414.437 | 4595.099 | 6704.72 | 5317.692 | 5837.059 | 5284.516 | 5291.65 | 5704.821 |
| 262 | 6488.889 | 5897.885 | 4942.671 | 5576.048 | 5228.633 | 5547.7 | 5413.785 | 4595.099 | 6704.72 | 5317.692 | 5837.059 | 5284.516 | 5291.65 | 5704.821 |
| 263 | 6488.889 | 5897.885 | 4942.671 | 5576.048 | 5228.633 | 5547.7 | 5413.133 | 4595.099 | 6704.72 | 5317.692 | 5837.059 | 5284.516 | 5291.65 | 5704.821 |
| 264 | 6488.889 | 5897.885 | 4942.671 | 5576.048 | 5228.633 | 5547.7 | 5412.482 | 4595.099 | 6704.72 | 5317.692 | 5837.059 | 5284.516 | 5291.65 | 5704.821 |
| 265 | 6488.889 | 5897.885 | 4942.671 | 5576.048 | 5228.633 | 5547.7 | 5411.83 | 4595.099 | 6704.72 | 5317.692 | 5837.059 | 5284.516 | 5291.65 | 5704.821 |
| 266 | 6488.889 | 5897.885 | 4942.671 | 5576.048 | 5228.633 | 5547.7 | 5411.179 | 4595.099 | 6704.72 | 5317.692 | 5837.059 | 5284.516 | 5291.65 | 5704.821 |
| 267 | 6488.889 | 5897.885 | 4942.671 | 5576.048 | 5228.633 | 5547.7 | 5410.528 | 4595.099 | 6704.72 | 5317.692 | 5837.059 | 5284.516 | 5291.65 | 5704.821 |
| 268 | 6488.889 | 5897.885 | 4942.671 | 5576.048 | 5228.633 | 5547.7 | 5409.877 | 4595.099 | 6704.72 | 5317.692 | 5837.059 | 5284.516 | 5291.65 | 5704.821 |
| 269 | 6488.889 | 5897.885 | 4942.671 | 5576.048 | 5228.633 | 5547.7 | 5409.226 | 4595.099 | 6704.72 | 5317.692 | 5837.059 | 5284.516 | 5291.65 | 5704.821 |
| 270 | 6488.889 | 5897.885 | 4942.671 | 5576.048 | 5228.633 | 5547.7 | 5408.576 | 4595.099 | 6704.72 | 5317.692 | 5837.059 | 5284.516 | 5291.65 | 5704.821 |
| 271 | 6488.889 | 5897.885 | 4942.671 | 5576.048 | 5228.633 | 5547.7 | 5407.925 | 4595.099 | 6704.72 | 5317.692 | 5837.059 | 5284.516 | 5291.65 | 5704.821 |
| 272 | 6488.889 | 5897.885 | 4942.671 | 5576.048 | 5228.633 | 5547.7 | 5407.275 | 4595.099 | 6704.72 | 5317.692 | 5837.059 | 5284.516 | 5291.65 | 5704.821 |
| 273 | 6488.889 | 5897.885 | 4942.671 | 5576.048 | 5228.633 | 5547.7 | 5406.625 | 4595.099 | 6704.72 | 5317.692 | 5837.059 | 5284.516 | 5291.65 | 5704.821 |
| 274 | 6488.889 | 5897.885 | 4942.671 | 5576.048 | 5228.633 | 5547.7 | 5405.975 | 4595.099 | 6704.72 | 5317.692 | 5837.059 | 5284.516 | 5291.65 | 5704.821 |
| 275 | 6488.889 | 5897.885 | 4942.671 | 5576.048 | 5228.633 | 5547.7 | 5405.325 | 4595.099 | 6704.72 | 5317.692 | 5837.059 | 5284.516 | 5291.65 | 5704.821 |
| 276 | 6488.889 | 5897.885 | 4942.671 | 5576.048 | 5228.633 | 5547.7 | 5404.675 | 4595.099 | 6704.72 | 5317.692 | 5837.059 | 5284.516 | 5291.65 | 5704.821 |
| 277 | 6488.889 | 5897.885 | 4942.671 | 5576.048 | 5228.633 | 5547.7 | 5404.026 | 4595.099 | 6704.72 | 5317.692 | 5837.059 | 5284.516 | 5291.65 | 5704.821 |
| 278 | 6488.889 | 5897.885 | 4942.671 | 5576.048 | 5228.633 | 5547.7 | 5403.376 | 4595.099 | 6704.72 | 5317.692 | 5837.059 | 5284.516 | 5291.65 | 5704.821 |
| 279 | 6488.889 | 5897.885 | 4942.671 | 5576.048 | 5228.633 | 5547.7 | 5402.727 | 4595.099 | 6704.72 | 5317.692 | 5837.059 | 5284.516 | 5291.65 | 5704.821 |
| 280 | 6488.889 | 5897.885 | 4942.671 | 5576.048 | 5228.633 | 5547.7 | 5402.078 | 4595.099 | 6704.72 | 5317.692 | 5837.059 | 5284.516 | 5291.65 | 5704.821 |
| 281 | 6488.889 | 5897.885 | 4942.671 | 5576.048 | 5228.633 | 5547.7 | 5401.429 | 4595.099 | 6704.72 | 5317.692 | 5837.059 | 5284.516 | 5291.65 | 5704.821 |
| 282 | 6488.889 | 5897.885 | 4942.671 | 5576.048 | 5228.633 | 5547.7 | 5400.78 | 4595.099 | 6704.72 | 5317.692 | 5837.059 | 5284.516 | 5291.65 | 5704.821 |
| 283 | 6488.889 | 5897.885 | 4942.671 | 5576.048 | 5228.633 | 5547.7 | 5400.132 | 4595.099 | 6704.72 | 5317.692 | 5837.059 | 5284.516 | 5291.65 | 5704.821 |
| 284 | 6488.889 | 5897.885 | 4942.671 | 5576.048 | 5228.633 | 5547.7 | 5399.483 | 4595.099 | 6704.72 | 5317.692 | 5837.059 | 5284.516 | 5291.65 | 5704.821 |
| 285 | 6488.889 | 5897.885 | 4942.671 | 5576.048 | 5228.633 | 5547.7 | 5398.835 | 4595.099 | 6704.72 | 5317.692 | 5837.059 | 5284.516 | 5291.65 | 5704.821 |
| 286 | 6488.889 | 5897.885 | 4942.671 | 5576.048 | 5228.633 | 5547.7 | 5398.187 | 4595.099 | 6704.72 | 5317.692 | 5837.059 | 5284.516 | 5291.65 | 5704.821 |
| 287 | 6488.889 | 5897.885 | 4942.671 | 5576.048 | 5228.633 | 5547.7 | 5397.539 | 4595.099 | 6704.72 | 5317.692 | 5837.059 | 5284.516 | 5291.65 | 5704.821 |
| 288 | 6488.889 | 5897.885 | 4942.671 | 5576.048 | 5228.633 | 5547.7 | 5396.891 | 4595.099 | 6704.72 | 5317.692 | 5837.059 | 5284.516 | 5291.65 | 5704.821 |
| 289 | 6488.889 | 5897.885 | 4942.671 | 5576.048 | 5228.633 | 5547.7 | 5396.244 | 4595.099 | 6704.72 | 5317.692 | 5837.059 | 5284.516 | 5291.65 | 5704.821 |
| 290 | 6488.889 | 5897.885 | 4942.671 | 5576.048 | 5228.633 | 5547.7 | 5395.596 | 4595.099 | 6704.72 | 5317.692 | 5837.059 | 5284.516 | 5291.65 | 5704.821 |
| 291 | 6488.889 | 5897.885 | 4942.671 | 5576.048 | 5228.633 | 5547.7 | 5394.949 | 4595.099 | 6704.72 | 5317.692 | 5837.059 | 5284.516 | 5291.65 | 5704.821 |
| 292 | 6488.889 | 5897.885 | 4942.671 | 5576.048 | 5228.633 | 5547.7 | 5394.302 | 4595.099 | 6704.72 | 5317.692 | 5837.059 | 5284.516 | 5291.65 | 5704.821 |
| 293 | 6488.889 | 5897.885 | 4942.671 | 5576.048 | 5228.633 | 5547.7 | 5393.654 | 4595.099 | 6704.72 | 5317.692 | 5837.059 | 5284.516 | 5291.65 | 5704.821 |
| 294 | 6488.889 | 5897.885 | 4942.671 | 5576.048 | 5228.633 | 5547.7 | 5393.008 | 4595.099 | 6704.72 | 5317.692 | 5837.059 | 5284.516 | 5291.65 | 5704.821 |
| 295 | 6488.889 | 5897.885 | 4942.671 | 5576.048 | 5228.633 | 5547.7 | 5392.361 | 4595.099 | 6704.72 | 5317.692 | 5837.059 | 5284.516 | 5291.65 | 5704.821 |
| 296 | 6488.889 | 5897.885 | 4942.671 | 5576.048 | 5228.633 | 5547.7 | 5391.714 | 4595.099 | 6704.72 | 5317.692 | 5837.059 | 5284.516 | 5291.65 | 5704.821 |
| 297 | 6488.889 | 5897.885 | 4942.671 | 5576.048 | 5228.633 | 5547.7 | 5391.068 | 4595.099 | 6704.72 | 5317.692 | 5837.059 | 5284.516 | 5291.65 | 5704.821 |
| 298 | 6488.889 | 5897.885 | 4942.671 | 5576.048 | 5228.633 | 5547.7 | 5390.422 | 4595.099 | 6704.72 | 5317.692 | 5837.059 | 5284.516 | 5291.65 | 5704.821 |
| 299 | 6488.889 | 5897.885 | 4942.671 | 5576.048 | 5228.633 | 5547.7 | 5389.776 | 4595.099 | 6704.72 | 5317.692 | 5837.059 | 5284.516 | 5291.65 | 5704.821 |